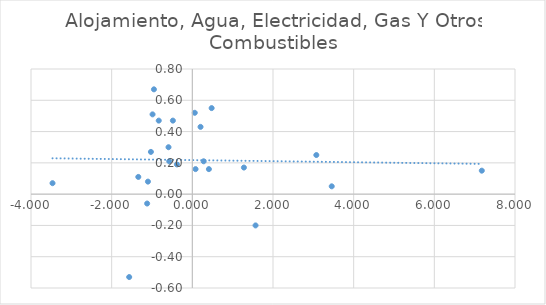
| Category | Alojamiento, Agua, Electricidad, Gas Y Otros Combustibles |
|---|---|
| 0.06052582200249956 | 0.52 |
| -1.339539147515001 | 0.11 |
| -1.1203229332582998 | -0.06 |
| -0.9862037445886013 | 0.51 |
| -3.4662710747771994 | 0.07 |
| 0.4103518494638997 | 0.16 |
| -1.5653149541481977 | -0.53 |
| 1.5673496706761991 | -0.2 |
| 7.1770364527009995 | 0.15 |
| 0.47884246635880034 | 0.55 |
| -0.832734952533401 | 0.47 |
| 3.4562493478376117 | 0.05 |
| 0.28079979651694786 | 0.21 |
| -0.5906758229193689 | 0.3 |
| -0.38208630553888956 | 0.19 |
| -0.5726169698249004 | 0.21 |
| 0.08025158798270066 | 0.16 |
| 1.2789830493301095 | 0.17 |
| -1.1005497828799102 | 0.08 |
| 0.20330044603610042 | 0.43 |
| -0.48222478231940147 | 0.47 |
| -0.9518304220709997 | 0.67 |
| -1.027059621055 | 0.27 |
| 3.074367518631871 | 0.25 |